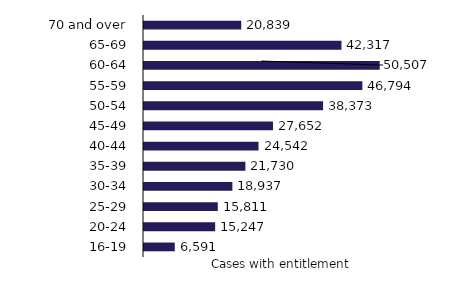
| Category | Series 0 |
|---|---|
| 16-19 | 6591 |
| 20-24 | 15247 |
| 25-29 | 15811 |
| 30-34 | 18937 |
| 35-39 | 21730 |
| 40-44 | 24542 |
| 45-49 | 27652 |
| 50-54 | 38373 |
| 55-59 | 46794 |
| 60-64 | 50507 |
| 65-69 | 42317 |
| 70 and over | 20839 |